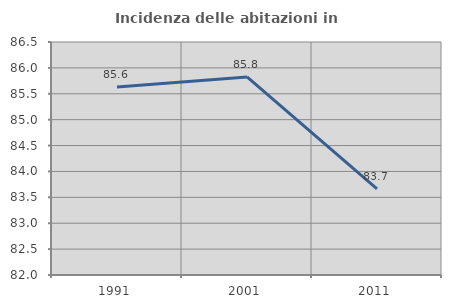
| Category | Incidenza delle abitazioni in proprietà  |
|---|---|
| 1991.0 | 85.632 |
| 2001.0 | 85.826 |
| 2011.0 | 83.665 |